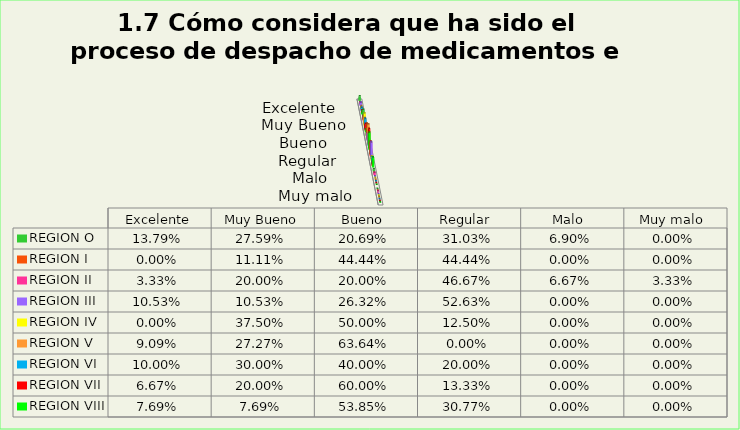
| Category | REGION O | REGION I  | REGION II | REGION III | REGION IV | REGION V  | REGION VI  | REGION VII  | REGION VIII |
|---|---|---|---|---|---|---|---|---|---|
| Excelente | 0.138 | 0 | 0.033 | 0.105 | 0 | 0.091 | 0.1 | 0.067 | 0.077 |
| Muy Bueno | 0.276 | 0.111 | 0.2 | 0.105 | 0.375 | 0.273 | 0.3 | 0.2 | 0.077 |
| Bueno  | 0.207 | 0.444 | 0.2 | 0.263 | 0.5 | 0.636 | 0.4 | 0.6 | 0.538 |
| Regular  | 0.31 | 0.444 | 0.467 | 0.526 | 0.125 | 0 | 0.2 | 0.133 | 0.308 |
| Malo  | 0.069 | 0 | 0.067 | 0 | 0 | 0 | 0 | 0 | 0 |
| Muy malo  | 0 | 0 | 0.033 | 0 | 0 | 0 | 0 | 0 | 0 |